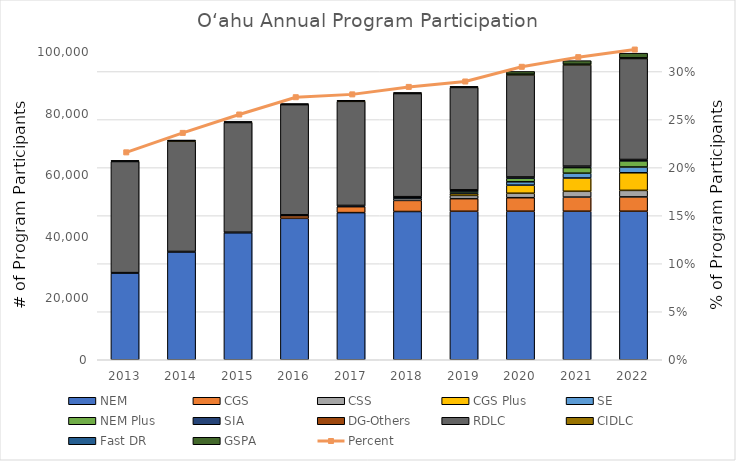
| Category | NEM | CGS | CSS | CGS Plus | SE | NEM Plus | SIA | DG-Others | RDLC | CIDLC | Fast DR | GSPA |
|---|---|---|---|---|---|---|---|---|---|---|---|---|
| 2013.0 | 28212 | 0 | 0 | 0 | 0 | 0 | 97 | 4 | 36100 | 198 | 38 | 0 |
| 2014.0 | 35044 | 0 | 0 | 0 | 0 | 0 | 138 | 6 | 35850 | 196 | 42 | 0 |
| 2015.0 | 41246 | 0 | 0 | 0 | 0 | 0 | 195 | 6 | 35629 | 191 | 42 | 0 |
| 2016.0 | 45951 | 907 | 5 | 0 | 0 | 0 | 226 | 6 | 35786 | 190 | 42 | 0 |
| 2017.0 | 47808 | 1930 | 128 | 0 | 0 | 0 | 270 | 6 | 33823 | 192 | 42 | 0 |
| 2018.0 | 48165 | 3605 | 699 | 74 | 127 | 0 | 314 | 7 | 33495 | 192 | 31 | 0 |
| 2019.0 | 48241 | 4098 | 1052 | 606 | 497 | 350 | 359 | 7 | 33260 | 192 | 23 | 0 |
| 2020.0 | 48256 | 4397 | 1440 | 2632 | 1092 | 1169 | 394 | 7 | 33170 | 206 | 18 | 890 |
| 2021.0 | 48256 | 4591 | 1889 | 4318 | 1563 | 1810 | 478 | 7 | 32889 | 203 | 17 | 1161 |
| 2022.0 | 48255 | 4657 | 2120 | 5722 | 1873 | 1990 | 449 | 7 | 32802 | 203 | 16 | 1524 |